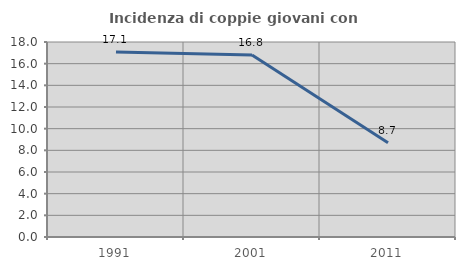
| Category | Incidenza di coppie giovani con figli |
|---|---|
| 1991.0 | 17.073 |
| 2001.0 | 16.809 |
| 2011.0 | 8.696 |